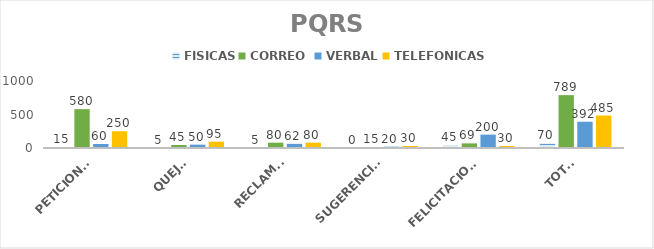
| Category | FISICAS | CORREO  | VERBAL | TELEFONICAS |
|---|---|---|---|---|
| PETICIONES | 15 | 580 | 60 | 250 |
| QUEJAS | 5 | 45 | 50 | 95 |
| RECLAMOS | 5 | 80 | 62 | 80 |
| SUGERENCIAS | 0 | 15 | 20 | 30 |
| FELICITACIONES | 45 | 69 | 200 | 30 |
| TOTAL | 70 | 789 | 392 | 485 |